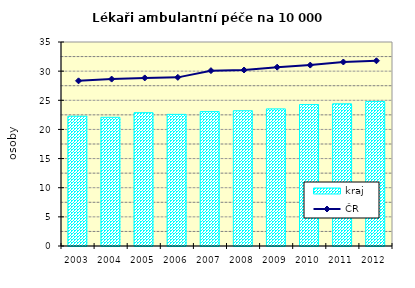
| Category | kraj |
|---|---|
| 2003.0 | 22.271 |
| 2004.0 | 22.078 |
| 2005.0 | 22.878 |
| 2006.0 | 22.584 |
| 2007.0 | 23.061 |
| 2008.0 | 23.205 |
| 2009.0 | 23.524 |
| 2010.0 | 24.266 |
| 2011.0 | 24.398 |
| 2012.0 | 24.798 |